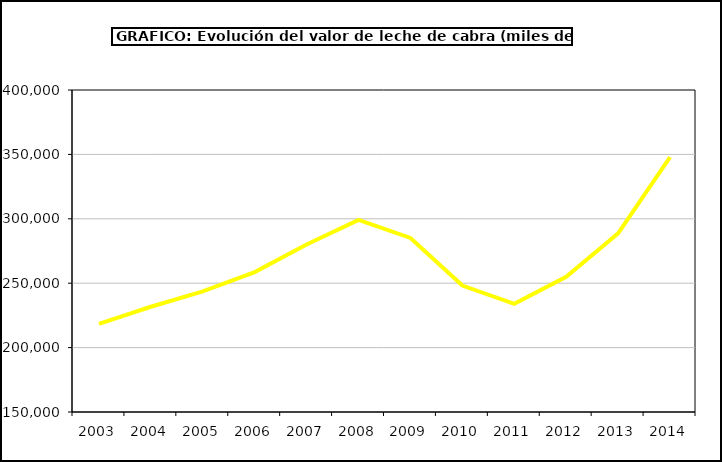
| Category | Leche de cabra |
|---|---|
| 2003.0 | 218490.65 |
| 2004.0 | 231722.481 |
| 2005.0 | 243629.865 |
| 2006.0 | 258652.812 |
| 2007.0 | 280100.354 |
| 2008.0 | 299168.815 |
| 2009.0 | 285112.802 |
| 2010.0 | 248183.34 |
| 2011.0 | 233957.713 |
| 2012.0 | 254951.239 |
| 2013.0 | 288752.444 |
| 2014.0 | 347968.832 |